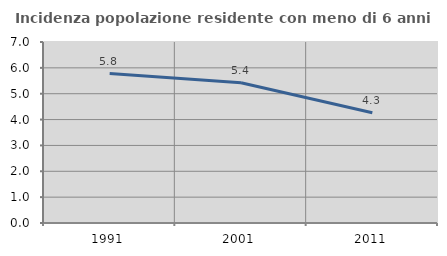
| Category | Incidenza popolazione residente con meno di 6 anni |
|---|---|
| 1991.0 | 5.777 |
| 2001.0 | 5.424 |
| 2011.0 | 4.261 |